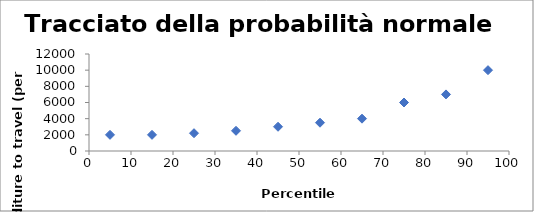
| Category | Series 0 |
|---|---|
| 5.0 | 2000 |
| 15.0 | 2000 |
| 25.0 | 2200 |
| 35.0 | 2500 |
| 45.0 | 3000 |
| 55.0 | 3500 |
| 65.0 | 4000 |
| 75.0 | 6000 |
| 85.0 | 7000 |
| 95.0 | 10000 |